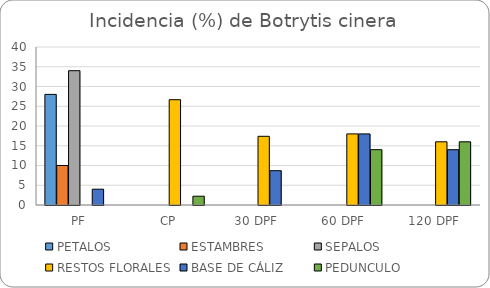
| Category | PETALOS  | ESTAMBRES | SEPALOS | RESTOS FLORALES | BASE DE CÁLIZ | PEDUNCULO |
|---|---|---|---|---|---|---|
| PF | 28 | 10 | 34 | 0 | 4 | 0 |
| CP | 0 | 0 | 0 | 26.66 | 0 | 2.22 |
| 30 DPF | 0 | 0 | 0 | 17.39 | 8.69 | 0 |
| 60 DPF  | 0 | 0 | 0 | 18 | 18 | 14 |
| 120 DPF | 0 | 0 | 0 | 16 | 14 | 16 |